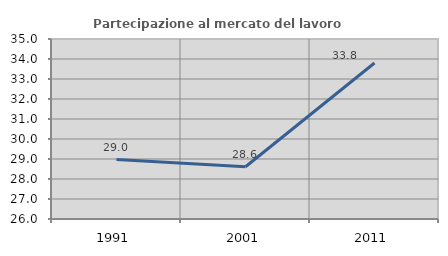
| Category | Partecipazione al mercato del lavoro  femminile |
|---|---|
| 1991.0 | 28.974 |
| 2001.0 | 28.614 |
| 2011.0 | 33.802 |